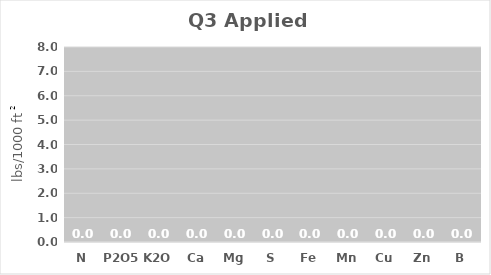
| Category | Q3 Applied Nutrients |
|---|---|
| N | 0 |
| P2O5 | 0 |
| K2O | 0 |
| Ca | 0 |
| Mg | 0 |
| S | 0 |
| Fe | 0 |
| Mn | 0 |
| Cu | 0 |
| Zn | 0 |
| B | 0 |